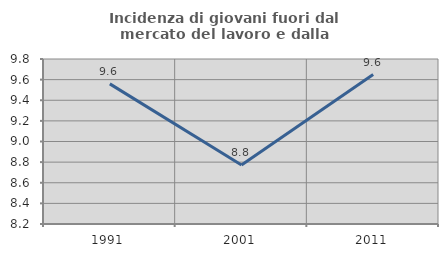
| Category | Incidenza di giovani fuori dal mercato del lavoro e dalla formazione  |
|---|---|
| 1991.0 | 9.559 |
| 2001.0 | 8.772 |
| 2011.0 | 9.649 |